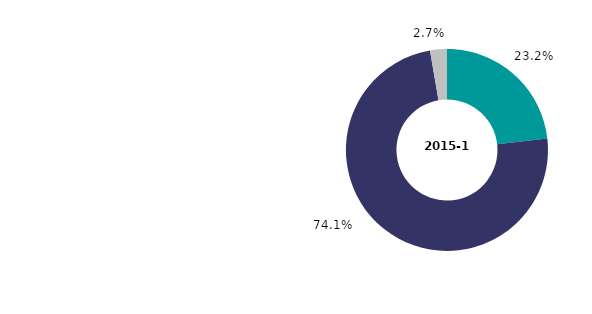
| Category | 2015-16 |
|---|---|
| single persons | 23.178 |
| couples | 74.126 |
| other types of households | 2.697 |